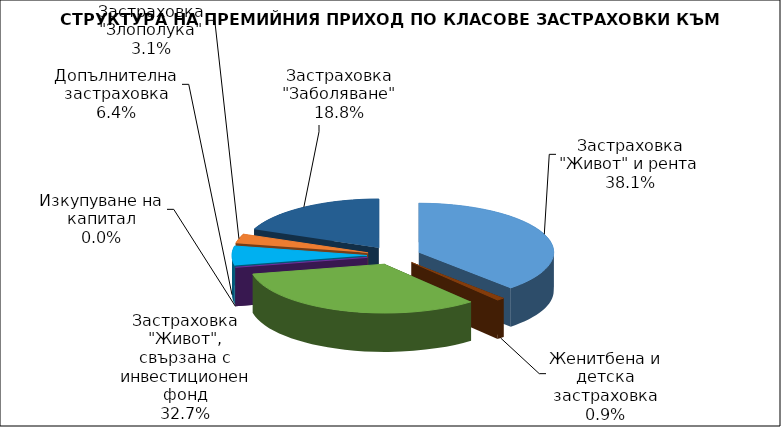
| Category | Застраховка "Живот" и рента |
|---|---|
| Застраховка "Живот" и рента | 101437430.55 |
| Женитбена и детска застраховка | 2488888.34 |
| Застраховка "Живот", свързана с инвестиционен фонд | 87288027.143 |
| Изкупуване на капитал | 0 |
| Допълнителна застраховка | 17033771.926 |
| Застраховка "Злополука" | 8303180.483 |
| Застраховка "Заболяване" | 50023051.46 |